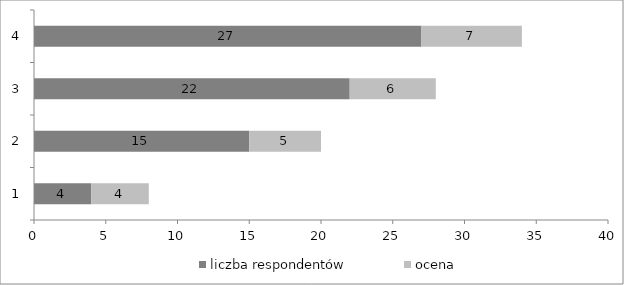
| Category | liczba respondentów | ocena |
|---|---|---|
| 0 | 4 | 4 |
| 1 | 15 | 5 |
| 2 | 22 | 6 |
| 3 | 27 | 7 |